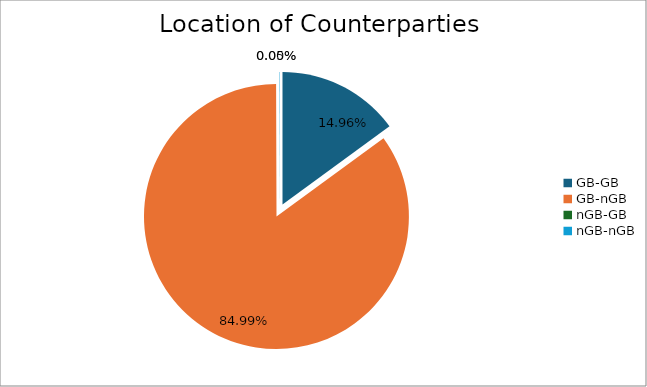
| Category | Series 0 |
|---|---|
| GB-GB | 1643800.765 |
| GB-nGB | 9338389.282 |
| nGB-GB | 0 |
| nGB-nGB | 5325.866 |